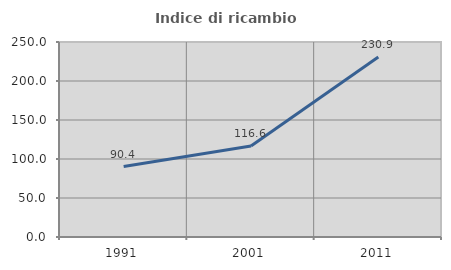
| Category | Indice di ricambio occupazionale  |
|---|---|
| 1991.0 | 90.369 |
| 2001.0 | 116.62 |
| 2011.0 | 230.871 |